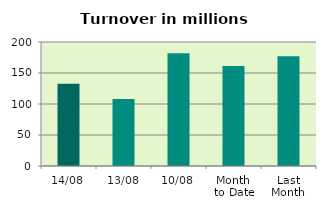
| Category | Series 0 |
|---|---|
| 14/08 | 132.678 |
| 13/08 | 107.988 |
| 10/08 | 181.849 |
| Month 
to Date | 161.441 |
| Last
Month | 177.022 |